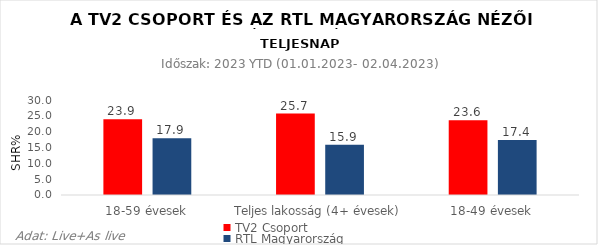
| Category | TV2 Csoport | RTL Magyarország |
|---|---|---|
| 18-59 évesek | 23.9 | 17.9 |
| Teljes lakosság (4+ évesek) | 25.7 | 15.9 |
| 18-49 évesek | 23.6 | 17.4 |